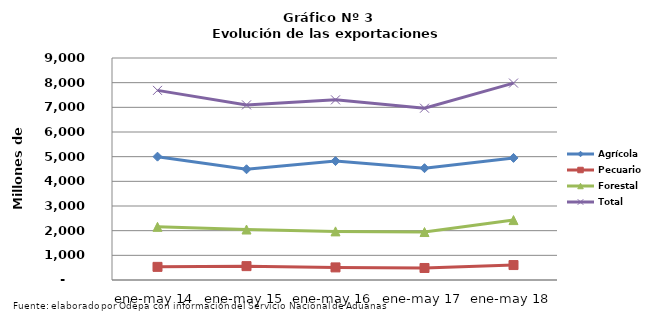
| Category | Agrícola | Pecuario | Forestal | Total |
|---|---|---|---|---|
| ene-may 14 | 5000183 | 532327 | 2155574 | 7688084 |
| ene-may 15 | 4489722 | 562188 | 2046515 | 7098425 |
| ene-may 16 | 4821359 | 510786 | 1971116 | 7303261 |
| ene-may 17 | 4532355 | 487220 | 1944844 | 6964419 |
| ene-may 18 | 4948569 | 605606 | 2429256 | 7983431 |